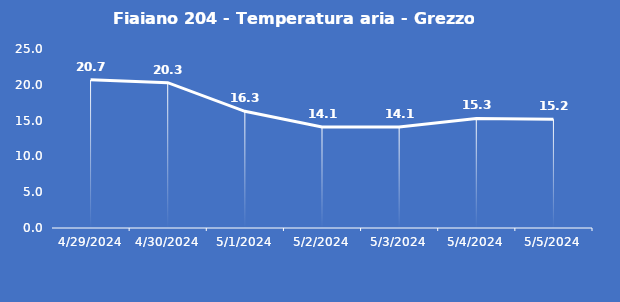
| Category | Fiaiano 204 - Temperatura aria - Grezzo (°C) |
|---|---|
| 4/29/24 | 20.7 |
| 4/30/24 | 20.3 |
| 5/1/24 | 16.3 |
| 5/2/24 | 14.1 |
| 5/3/24 | 14.1 |
| 5/4/24 | 15.3 |
| 5/5/24 | 15.2 |